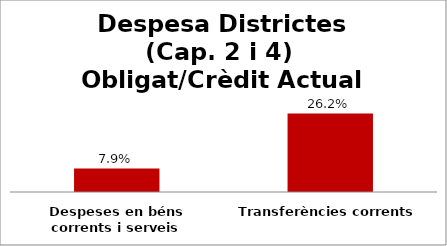
| Category | Series 0 |
|---|---|
| Despeses en béns corrents i serveis | 0.079 |
| Transferències corrents | 0.262 |